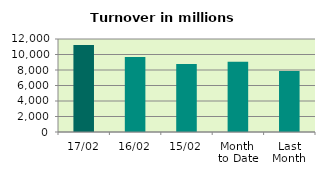
| Category | Series 0 |
|---|---|
| 17/02 | 11231.238 |
| 16/02 | 9673.74 |
| 15/02 | 8764.748 |
| Month 
to Date | 9061.265 |
| Last
Month | 7855.802 |